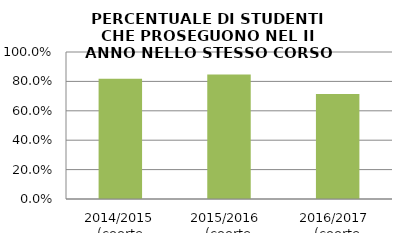
| Category | 2014/2015 (coorte 2013/14) 2015/2016  (coorte 2014/15) 2016/2017  (coorte 2015/16) |
|---|---|
| 2014/2015 (coorte 2013/14) | 0.818 |
| 2015/2016  (coorte 2014/15) | 0.846 |
| 2016/2017  (coorte 2015/16) | 0.714 |